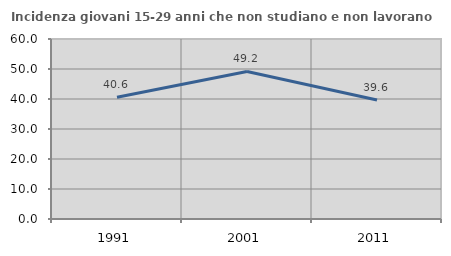
| Category | Incidenza giovani 15-29 anni che non studiano e non lavorano  |
|---|---|
| 1991.0 | 40.58 |
| 2001.0 | 49.172 |
| 2011.0 | 39.648 |